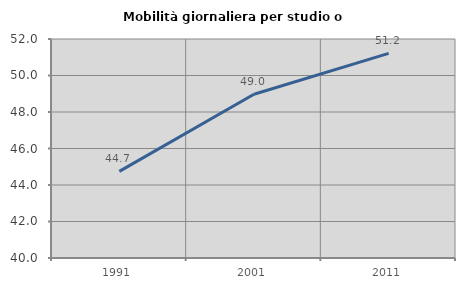
| Category | Mobilità giornaliera per studio o lavoro |
|---|---|
| 1991.0 | 44.746 |
| 2001.0 | 48.974 |
| 2011.0 | 51.212 |